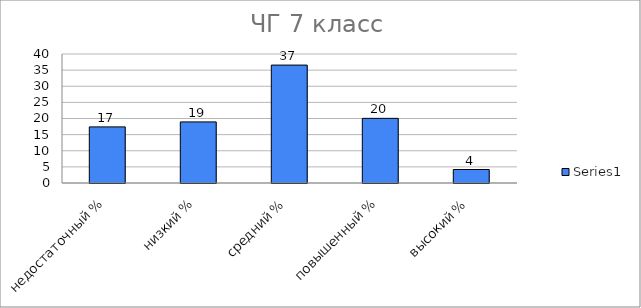
| Category | Series 0 |
|---|---|
| недостаточный % | 17.401 |
| низкий % | 18.943 |
| средний % | 36.564 |
| повышенный % | 20.044 |
| высокий % | 4.185 |